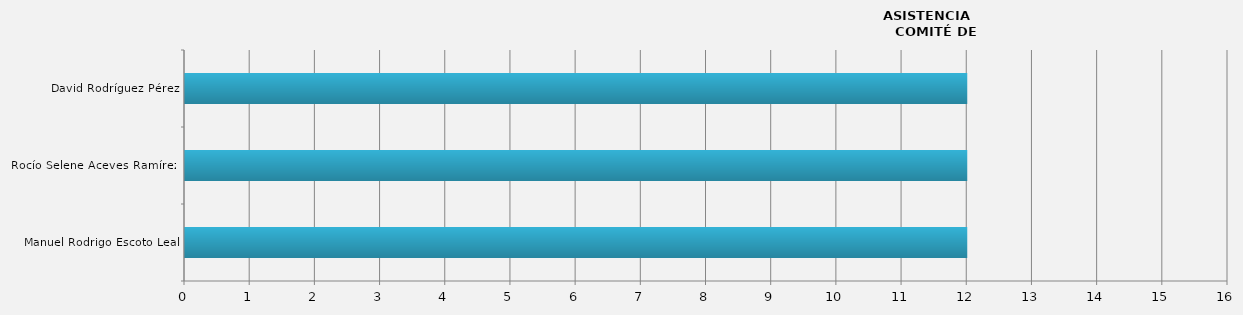
| Category | Series 0 |
|---|---|
| Manuel Rodrigo Escoto Leal | 12 |
| Rocío Selene Aceves Ramírez  | 12 |
| David Rodríguez Pérez | 12 |